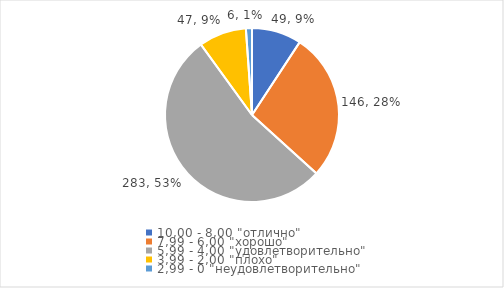
| Category | Series 0 | Series 1 |
|---|---|---|
| 10,00 - 8,00 "отлично" | 49 | 0.092 |
| 7,99 - 6,00 "хорошо" | 146 | 0.275 |
| 5,99 - 4,00 "удовлетворительно" | 283 | 0.533 |
| 3,99 - 2,00 "плохо" | 47 | 0.089 |
| 2,99 - 0 "неудовлетворительно" | 6 | 0.011 |